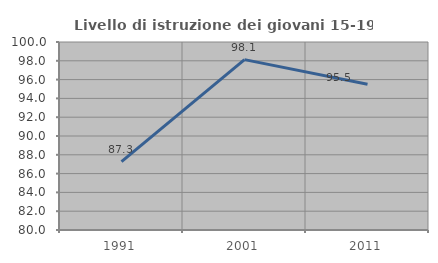
| Category | Livello di istruzione dei giovani 15-19 anni |
|---|---|
| 1991.0 | 87.266 |
| 2001.0 | 98.122 |
| 2011.0 | 95.51 |